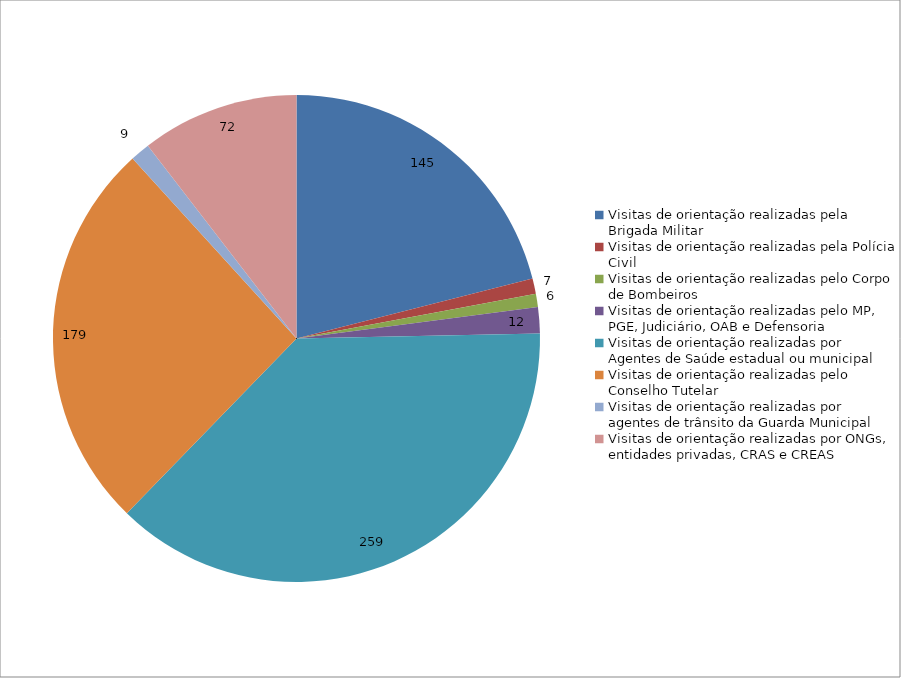
| Category | Series 0 |
|---|---|
| Visitas de orientação realizadas pela Brigada Militar | 145 |
| Visitas de orientação realizadas pela Polícia Civil | 7 |
| Visitas de orientação realizadas pelo Corpo de Bombeiros | 6 |
| Visitas de orientação realizadas pelo MP, PGE, Judiciário, OAB e Defensoria | 12 |
| Visitas de orientação realizadas por Agentes de Saúde estadual ou municipal | 259 |
| Visitas de orientação realizadas pelo Conselho Tutelar | 179 |
| Visitas de orientação realizadas por agentes de trânsito da Guarda Municipal | 9 |
| Visitas de orientação realizadas por ONGs, entidades privadas, CRAS e CREAS | 72 |